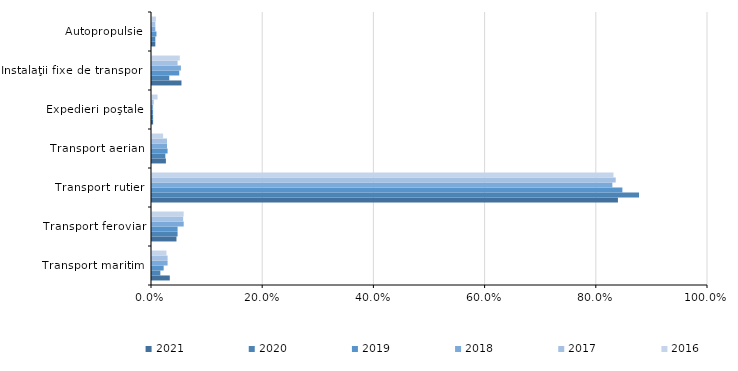
| Category | 2021 | 2020 | 2019 | 2018 | 2017 | 2016 |
|---|---|---|---|---|---|---|
| Transport maritim | 3.2 | 1.5 | 2.1 | 2.8 | 2.8 | 2.6 |
| Transport feroviar | 4.4 | 4.6 | 4.6 | 5.7 | 5.6 | 5.7 |
| Transport rutier | 83.8 | 87.6 | 84.6 | 82.8 | 83.4 | 83 |
| Transport aerian | 2.5 | 2.4 | 2.8 | 2.7 | 2.7 | 2 |
| Expedieri poştale | 0.2 | 0.2 | 0.2 | 0.2 | 0.3 | 1 |
| Instalaţii fixe de transport | 5.3 | 3.1 | 4.9 | 5.2 | 4.6 | 5 |
| Autopropulsie | 0.6 | 0.6 | 0.8 | 0.6 | 0.6 | 0.7 |